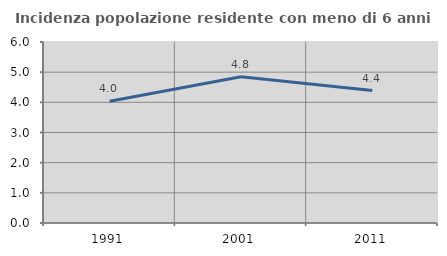
| Category | Incidenza popolazione residente con meno di 6 anni |
|---|---|
| 1991.0 | 4.039 |
| 2001.0 | 4.849 |
| 2011.0 | 4.39 |